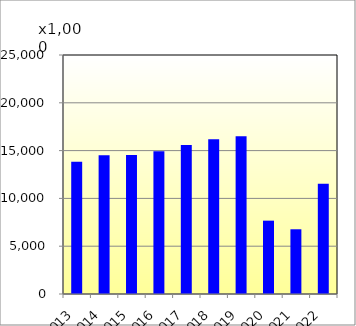
| Category | DOM | INT |
|---|---|---|
| 2013 | 13823922 | 0 |
| 2014 | 14526575 | 0 |
| 2015 | 14541634 | 302 |
| 2016 | 14923678 | 0 |
| 2017 | 15597777 | 0 |
| 2018 | 16184901 | 0 |
| 2019 | 16504209 | 0 |
| 2020 | 7672386 | 0 |
| 2021 | 6770089 | 0 |
| 2022 | 11528144 | 0 |